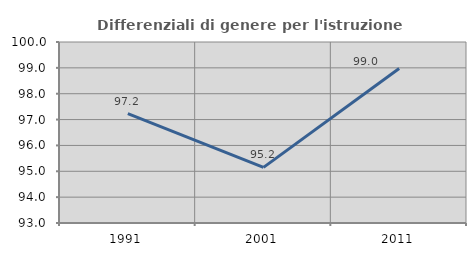
| Category | Differenziali di genere per l'istruzione superiore |
|---|---|
| 1991.0 | 97.228 |
| 2001.0 | 95.152 |
| 2011.0 | 98.978 |